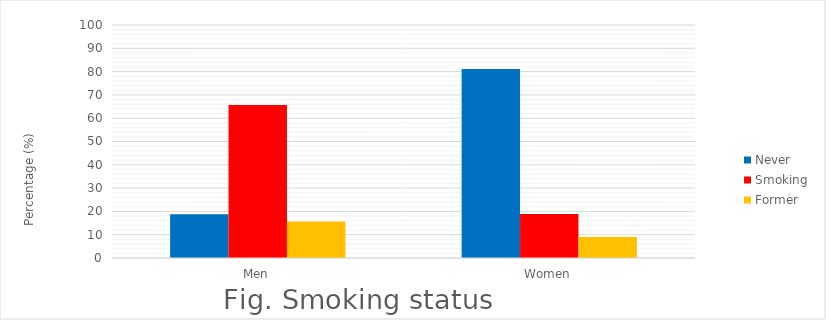
| Category | Never | Smoking | Former |
|---|---|---|---|
| Men | 18.75 | 65.625 | 15.625 |
| Women | 81.1 | 18.9 | 9 |